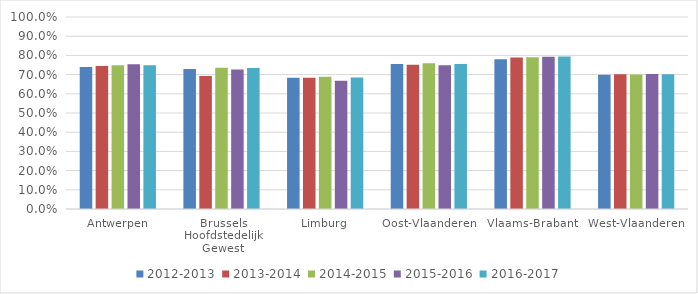
| Category | 2012-2013 | 2013-2014 | 2014-2015 | 2015-2016 | 2016-2017 |
|---|---|---|---|---|---|
| Antwerpen | 0.74 | 0.745 | 0.749 | 0.754 | 0.748 |
| Brussels Hoofdstedelijk Gewest | 0.729 | 0.693 | 0.735 | 0.727 | 0.734 |
| Limburg | 0.684 | 0.684 | 0.689 | 0.668 | 0.685 |
| Oost-Vlaanderen | 0.755 | 0.751 | 0.759 | 0.748 | 0.755 |
| Vlaams-Brabant | 0.781 | 0.79 | 0.791 | 0.793 | 0.794 |
| West-Vlaanderen | 0.7 | 0.701 | 0.701 | 0.703 | 0.702 |